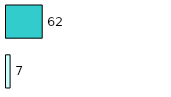
| Category | Series 0 | Series 1 |
|---|---|---|
| 0 | 7 | 62 |